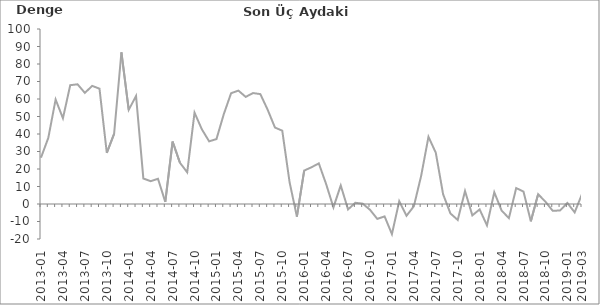
| Category | Denge  |
|---|---|
| 2013-01 | 26.5 |
|  | 37.8 |
|  | 59.7 |
| 2013-04 | 49 |
|  | 67.9 |
|  | 68.4 |
| 2013-07 | 63.5 |
|  | 67.5 |
|  | 65.9 |
| 2013-10 | 29.2 |
|  | 40.1 |
|  | 86.7 |
| 2014-01 | 53.8 |
|  | 61.7 |
|  | 14.6 |
| 2014-04 | 13 |
|  | 14.4 |
|  | 1.2 |
| 2014-07 | 35.7 |
|  | 23.6 |
|  | 18.1 |
| 2014-10 | 52.2 |
|  | 42.7 |
|  | 35.8 |
| 2015-01 | 37.1 |
|  | 51.3 |
|  | 63.3 |
| 2015-04 | 64.8 |
|  | 61.2 |
|  | 63.4 |
| 2015-07 | 62.8 |
|  | 53.9 |
|  | 43.7 |
| 2015-10 | 41.9 |
|  | 12.5 |
|  | -7.2 |
| 2016-01 | 19.1 |
|  | 21 |
|  | 23.2 |
| 2016-04 | 11.4 |
|  | -1.9 |
|  | 10.6 |
| 2016-07 | -3.1 |
|  | 0.7 |
|  | 0.2 |
| 2016-10 | -3.3 |
|  | -8.5 |
|  | -7.1 |
| 2017-01 | -17.2 |
|  | 1.6 |
|  | -6.7 |
| 2017-04 | -1.3 |
|  | 16.1 |
|  | 38.4 |
| 2017-07 | 29.3 |
|  | 5.6 |
|  | -5.4 |
| 2017-10 | -9.1 |
|  | 7.4 |
|  | -6.5 |
| 2018-01 | -3.1 |
|  | -12.2 |
|  | 6.7 |
| 2018-04 | -3.7 |
|  | -8.1 |
|  | 9.1 |
| 2018-07 | 7.1 |
|  | -9.9 |
|  | 5.6 |
| 2018-10 | 1.3 |
|  | -3.9 |
|  | -3.7 |
| 2019-01 | 0.6 |
|  | -4.8 |
| 2019-03 | 5.7 |